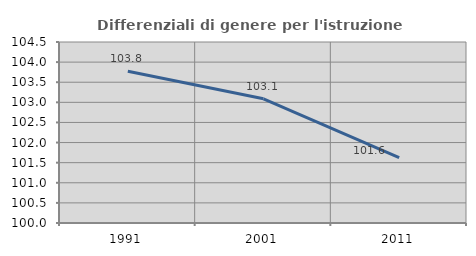
| Category | Differenziali di genere per l'istruzione superiore |
|---|---|
| 1991.0 | 103.774 |
| 2001.0 | 103.088 |
| 2011.0 | 101.623 |